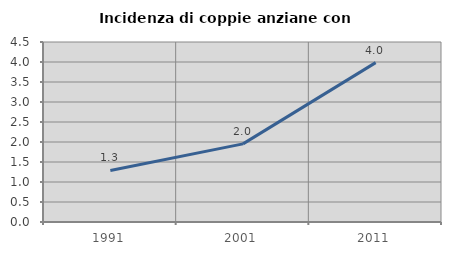
| Category | Incidenza di coppie anziane con figli |
|---|---|
| 1991.0 | 1.288 |
| 2001.0 | 1.953 |
| 2011.0 | 3.984 |